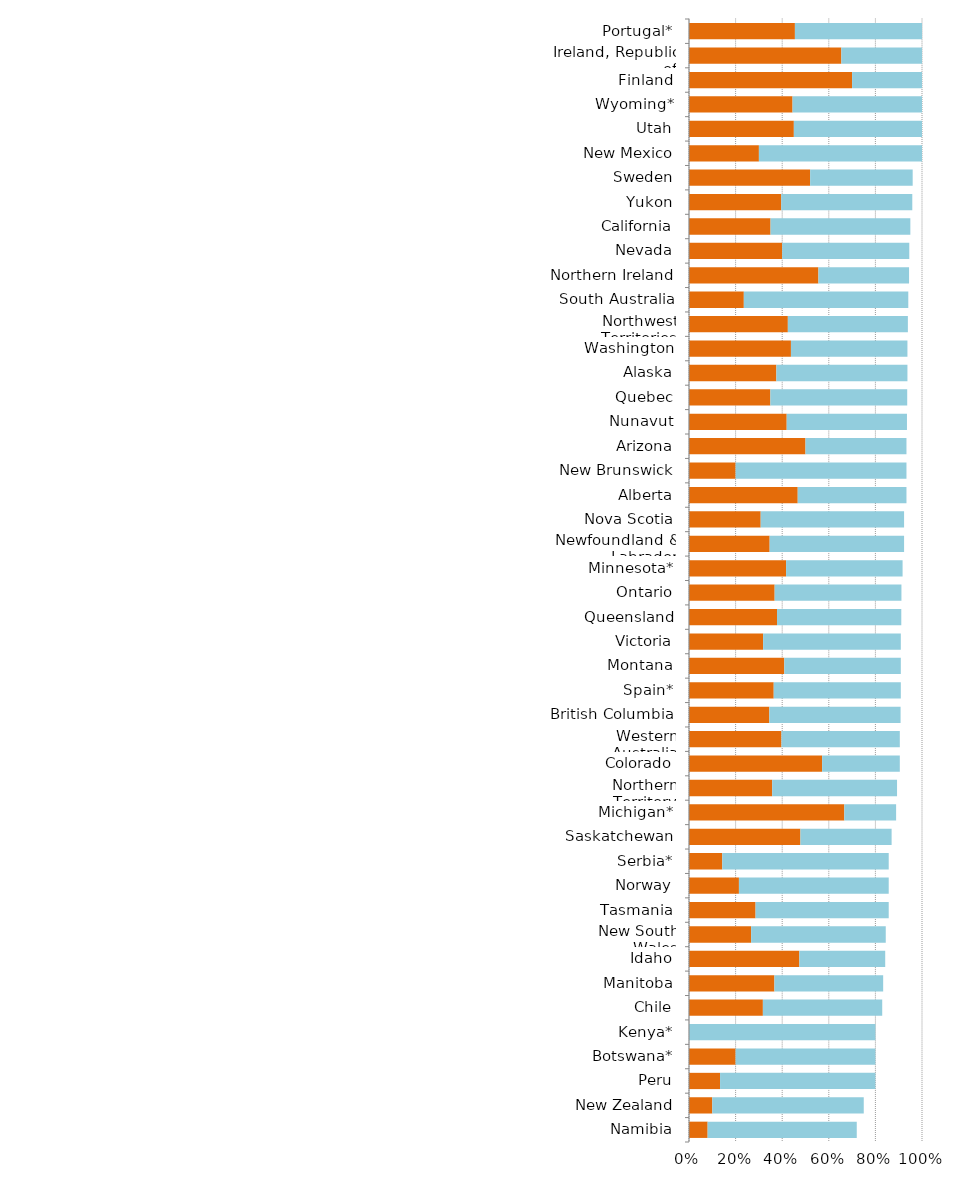
| Category | Series 0 | Series 1 |
|---|---|---|
| Namibia | 0.08 | 0.64 |
| New Zealand | 0.1 | 0.65 |
| Peru | 0.133 | 0.667 |
| Botswana* | 0.2 | 0.6 |
| Kenya* | 0 | 0.8 |
| Chile | 0.317 | 0.512 |
| Manitoba | 0.367 | 0.467 |
| Idaho | 0.474 | 0.368 |
| New South Wales | 0.267 | 0.578 |
| Tasmania | 0.286 | 0.571 |
| Norway | 0.214 | 0.643 |
| Serbia* | 0.143 | 0.714 |
| Saskatchewan | 0.478 | 0.391 |
| Michigan* | 0.667 | 0.222 |
| Northern Territory | 0.357 | 0.536 |
| Colorado | 0.571 | 0.333 |
| Western Australia | 0.397 | 0.508 |
| British Columbia | 0.345 | 0.563 |
| Spain* | 0.364 | 0.545 |
| Montana | 0.409 | 0.5 |
| Victoria | 0.318 | 0.591 |
| Queensland | 0.378 | 0.533 |
| Ontario | 0.368 | 0.544 |
| Minnesota* | 0.417 | 0.5 |
| Newfoundland & Labrador | 0.346 | 0.577 |
| Nova Scotia | 0.308 | 0.615 |
| Alberta | 0.467 | 0.467 |
| New Brunswick | 0.2 | 0.733 |
| Arizona | 0.5 | 0.433 |
| Nunavut | 0.419 | 0.516 |
| Quebec | 0.349 | 0.587 |
| Alaska | 0.375 | 0.562 |
| Washington | 0.438 | 0.5 |
| Northwest Territories | 0.424 | 0.515 |
| South Australia | 0.235 | 0.706 |
| Northern Ireland | 0.556 | 0.389 |
| Nevada | 0.4 | 0.545 |
| California | 0.35 | 0.6 |
| Yukon | 0.396 | 0.562 |
| Sweden | 0.52 | 0.44 |
| New Mexico | 0.3 | 0.7 |
| Utah | 0.45 | 0.55 |
| Wyoming* | 0.444 | 0.556 |
| Finland | 0.7 | 0.3 |
| Ireland, Republic of | 0.654 | 0.346 |
| Portugal* | 0.455 | 0.545 |